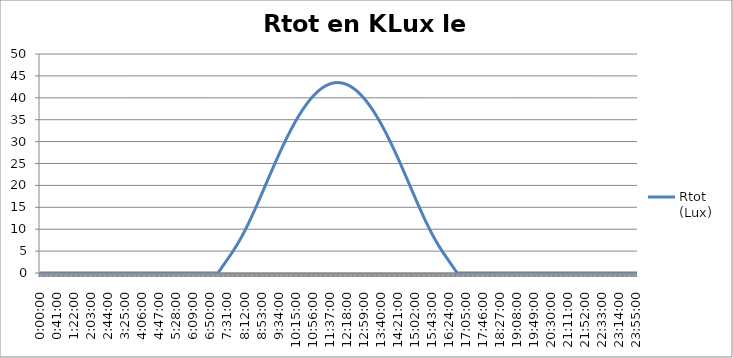
| Category | Rtot
(Lux) |
|---|---|
| 0.0 | 0 |
| 0.0006944444444444445 | 0 |
| 0.001388888888888889 | 0 |
| 0.0020833333333333333 | 0 |
| 0.002777777777777778 | 0 |
| 0.0034722222222222225 | 0 |
| 0.004166666666666667 | 0 |
| 0.004861111111111111 | 0 |
| 0.005555555555555556 | 0 |
| 0.00625 | 0 |
| 0.006944444444444445 | 0 |
| 0.0076388888888888895 | 0 |
| 0.008333333333333333 | 0 |
| 0.009027777777777777 | 0 |
| 0.00972222222222222 | 0 |
| 0.010416666666666664 | 0 |
| 0.011111111111111108 | 0 |
| 0.011805555555555552 | 0 |
| 0.012499999999999995 | 0 |
| 0.01319444444444444 | 0 |
| 0.013888888888888883 | 0 |
| 0.014583333333333327 | 0 |
| 0.01527777777777777 | 0 |
| 0.015972222222222214 | 0 |
| 0.01666666666666666 | 0 |
| 0.017361111111111105 | 0 |
| 0.01805555555555555 | 0 |
| 0.018749999999999996 | 0 |
| 0.01944444444444444 | 0 |
| 0.020138888888888887 | 0 |
| 0.020833333333333332 | 0 |
| 0.021527777777777778 | 0 |
| 0.022222222222222223 | 0 |
| 0.02291666666666667 | 0 |
| 0.023611111111111114 | 0 |
| 0.02430555555555556 | 0 |
| 0.025000000000000005 | 0 |
| 0.02569444444444445 | 0 |
| 0.026388888888888896 | 0 |
| 0.02708333333333334 | 0 |
| 0.027777777777777787 | 0 |
| 0.028472222222222232 | 0 |
| 0.029166666666666678 | 0 |
| 0.029861111111111123 | 0 |
| 0.03055555555555557 | 0 |
| 0.031250000000000014 | 0 |
| 0.031944444444444456 | 0 |
| 0.0326388888888889 | 0 |
| 0.03333333333333334 | 0 |
| 0.03402777777777778 | 0 |
| 0.034722222222222224 | 0 |
| 0.035416666666666666 | 0 |
| 0.03611111111111111 | 0 |
| 0.03680555555555555 | 0 |
| 0.03749999999999999 | 0 |
| 0.038194444444444434 | 0 |
| 0.038888888888888876 | 0 |
| 0.03958333333333332 | 0 |
| 0.04027777777777776 | 0 |
| 0.0409722222222222 | 0 |
| 0.041666666666666644 | 0 |
| 0.042361111111111086 | 0 |
| 0.04305555555555553 | 0 |
| 0.04374999999999997 | 0 |
| 0.04444444444444441 | 0 |
| 0.04513888888888885 | 0 |
| 0.045833333333333295 | 0 |
| 0.04652777777777774 | 0 |
| 0.04722222222222218 | 0 |
| 0.04791666666666662 | 0 |
| 0.04861111111111106 | 0 |
| 0.049305555555555505 | 0 |
| 0.04999999999999995 | 0 |
| 0.05069444444444439 | 0 |
| 0.05138888888888883 | 0 |
| 0.05208333333333327 | 0 |
| 0.052777777777777715 | 0 |
| 0.05347222222222216 | 0 |
| 0.0541666666666666 | 0 |
| 0.05486111111111104 | 0 |
| 0.05555555555555548 | 0 |
| 0.056249999999999925 | 0 |
| 0.05694444444444437 | 0 |
| 0.05763888888888881 | 0 |
| 0.05833333333333325 | 0 |
| 0.05902777777777769 | 0 |
| 0.059722222222222135 | 0 |
| 0.06041666666666658 | 0 |
| 0.06111111111111102 | 0 |
| 0.06180555555555546 | 0 |
| 0.0624999999999999 | 0 |
| 0.06319444444444434 | 0 |
| 0.06388888888888879 | 0 |
| 0.06458333333333323 | 0 |
| 0.06527777777777767 | 0 |
| 0.06597222222222211 | 0 |
| 0.06666666666666655 | 0 |
| 0.067361111111111 | 0 |
| 0.06805555555555544 | 0 |
| 0.06874999999999988 | 0 |
| 0.06944444444444432 | 0 |
| 0.07013888888888876 | 0 |
| 0.0708333333333332 | 0 |
| 0.07152777777777765 | 0 |
| 0.07222222222222209 | 0 |
| 0.07291666666666653 | 0 |
| 0.07361111111111097 | 0 |
| 0.07430555555555542 | 0 |
| 0.07499999999999986 | 0 |
| 0.0756944444444443 | 0 |
| 0.07638888888888874 | 0 |
| 0.07708333333333318 | 0 |
| 0.07777777777777763 | 0 |
| 0.07847222222222207 | 0 |
| 0.07916666666666651 | 0 |
| 0.07986111111111095 | 0 |
| 0.0805555555555554 | 0 |
| 0.08124999999999984 | 0 |
| 0.08194444444444428 | 0 |
| 0.08263888888888872 | 0 |
| 0.08333333333333316 | 0 |
| 0.0840277777777776 | 0 |
| 0.08472222222222205 | 0 |
| 0.08541666666666649 | 0 |
| 0.08611111111111093 | 0 |
| 0.08680555555555537 | 0 |
| 0.08749999999999981 | 0 |
| 0.08819444444444426 | 0 |
| 0.0888888888888887 | 0 |
| 0.08958333333333314 | 0 |
| 0.09027777777777758 | 0 |
| 0.09097222222222202 | 0 |
| 0.09166666666666647 | 0 |
| 0.09236111111111091 | 0 |
| 0.09305555555555535 | 0 |
| 0.09374999999999979 | 0 |
| 0.09444444444444423 | 0 |
| 0.09513888888888868 | 0 |
| 0.09583333333333312 | 0 |
| 0.09652777777777756 | 0 |
| 0.097222222222222 | 0 |
| 0.09791666666666644 | 0 |
| 0.09861111111111089 | 0 |
| 0.09930555555555533 | 0 |
| 0.09999999999999977 | 0 |
| 0.10069444444444421 | 0 |
| 0.10138888888888865 | 0 |
| 0.1020833333333331 | 0 |
| 0.10277777777777754 | 0 |
| 0.10347222222222198 | 0 |
| 0.10416666666666642 | 0 |
| 0.10486111111111086 | 0 |
| 0.1055555555555553 | 0 |
| 0.10624999999999975 | 0 |
| 0.10694444444444419 | 0 |
| 0.10763888888888863 | 0 |
| 0.10833333333333307 | 0 |
| 0.10902777777777752 | 0 |
| 0.10972222222222196 | 0 |
| 0.1104166666666664 | 0 |
| 0.11111111111111084 | 0 |
| 0.11180555555555528 | 0 |
| 0.11249999999999973 | 0 |
| 0.11319444444444417 | 0 |
| 0.11388888888888861 | 0 |
| 0.11458333333333305 | 0 |
| 0.1152777777777775 | 0 |
| 0.11597222222222194 | 0 |
| 0.11666666666666638 | 0 |
| 0.11736111111111082 | 0 |
| 0.11805555555555526 | 0 |
| 0.1187499999999997 | 0 |
| 0.11944444444444414 | 0 |
| 0.12013888888888859 | 0 |
| 0.12083333333333303 | 0 |
| 0.12152777777777747 | 0 |
| 0.12222222222222191 | 0 |
| 0.12291666666666635 | 0 |
| 0.1236111111111108 | 0 |
| 0.12430555555555524 | 0 |
| 0.12499999999999968 | 0 |
| 0.12569444444444414 | 0 |
| 0.12638888888888858 | 0 |
| 0.12708333333333302 | 0 |
| 0.12777777777777746 | 0 |
| 0.1284722222222219 | 0 |
| 0.12916666666666635 | 0 |
| 0.1298611111111108 | 0 |
| 0.13055555555555523 | 0 |
| 0.13124999999999967 | 0 |
| 0.13194444444444411 | 0 |
| 0.13263888888888856 | 0 |
| 0.133333333333333 | 0 |
| 0.13402777777777744 | 0 |
| 0.13472222222222188 | 0 |
| 0.13541666666666632 | 0 |
| 0.13611111111111077 | 0 |
| 0.1368055555555552 | 0 |
| 0.13749999999999965 | 0 |
| 0.1381944444444441 | 0 |
| 0.13888888888888853 | 0 |
| 0.13958333333333298 | 0 |
| 0.14027777777777742 | 0 |
| 0.14097222222222186 | 0 |
| 0.1416666666666663 | 0 |
| 0.14236111111111074 | 0 |
| 0.14305555555555519 | 0 |
| 0.14374999999999963 | 0 |
| 0.14444444444444407 | 0 |
| 0.1451388888888885 | 0 |
| 0.14583333333333295 | 0 |
| 0.1465277777777774 | 0 |
| 0.14722222222222184 | 0 |
| 0.14791666666666628 | 0 |
| 0.14861111111111072 | 0 |
| 0.14930555555555516 | 0 |
| 0.1499999999999996 | 0 |
| 0.15069444444444405 | 0 |
| 0.1513888888888885 | 0 |
| 0.15208333333333293 | 0 |
| 0.15277777777777737 | 0 |
| 0.15347222222222182 | 0 |
| 0.15416666666666626 | 0 |
| 0.1548611111111107 | 0 |
| 0.15555555555555514 | 0 |
| 0.15624999999999958 | 0 |
| 0.15694444444444403 | 0 |
| 0.15763888888888847 | 0 |
| 0.1583333333333329 | 0 |
| 0.15902777777777735 | 0 |
| 0.1597222222222218 | 0 |
| 0.16041666666666624 | 0 |
| 0.16111111111111068 | 0 |
| 0.16180555555555512 | 0 |
| 0.16249999999999956 | 0 |
| 0.163194444444444 | 0 |
| 0.16388888888888845 | 0 |
| 0.1645833333333329 | 0 |
| 0.16527777777777733 | 0 |
| 0.16597222222222177 | 0 |
| 0.1666666666666662 | 0 |
| 0.16736111111111066 | 0 |
| 0.1680555555555551 | 0 |
| 0.16874999999999954 | 0 |
| 0.16944444444444398 | 0 |
| 0.17013888888888842 | 0 |
| 0.17083333333333287 | 0 |
| 0.1715277777777773 | 0 |
| 0.17222222222222175 | 0 |
| 0.1729166666666662 | 0 |
| 0.17361111111111063 | 0 |
| 0.17430555555555508 | 0 |
| 0.17499999999999952 | 0 |
| 0.17569444444444396 | 0 |
| 0.1763888888888884 | 0 |
| 0.17708333333333284 | 0 |
| 0.17777777777777728 | 0 |
| 0.17847222222222173 | 0 |
| 0.17916666666666617 | 0 |
| 0.1798611111111106 | 0 |
| 0.18055555555555505 | 0 |
| 0.1812499999999995 | 0 |
| 0.18194444444444394 | 0 |
| 0.18263888888888838 | 0 |
| 0.18333333333333282 | 0 |
| 0.18402777777777726 | 0 |
| 0.1847222222222217 | 0 |
| 0.18541666666666615 | 0 |
| 0.1861111111111106 | 0 |
| 0.18680555555555503 | 0 |
| 0.18749999999999947 | 0 |
| 0.18819444444444391 | 0 |
| 0.18888888888888836 | 0 |
| 0.1895833333333328 | 0 |
| 0.19027777777777724 | 0 |
| 0.19097222222222168 | 0 |
| 0.19166666666666612 | 0 |
| 0.19236111111111057 | 0 |
| 0.193055555555555 | 0 |
| 0.19374999999999945 | 0 |
| 0.1944444444444439 | 0 |
| 0.19513888888888833 | 0 |
| 0.19583333333333278 | 0 |
| 0.19652777777777722 | 0 |
| 0.19722222222222166 | 0 |
| 0.1979166666666661 | 0 |
| 0.19861111111111054 | 0 |
| 0.199305555555555 | 0 |
| 0.19999999999999943 | 0 |
| 0.20069444444444387 | 0 |
| 0.2013888888888883 | 0 |
| 0.20208333333333275 | 0 |
| 0.2027777777777772 | 0 |
| 0.20347222222222164 | 0 |
| 0.20416666666666608 | 0 |
| 0.20486111111111052 | 0 |
| 0.20555555555555496 | 0 |
| 0.2062499999999994 | 0 |
| 0.20694444444444385 | 0 |
| 0.2076388888888883 | 0 |
| 0.20833333333333273 | 0 |
| 0.20902777777777717 | 0 |
| 0.20972222222222162 | 0 |
| 0.21041666666666606 | 0 |
| 0.2111111111111105 | 0 |
| 0.21180555555555494 | 0 |
| 0.21249999999999938 | 0 |
| 0.21319444444444383 | 0 |
| 0.21388888888888827 | 0 |
| 0.2145833333333327 | 0 |
| 0.21527777777777715 | 0 |
| 0.2159722222222216 | 0 |
| 0.21666666666666604 | 0 |
| 0.21736111111111048 | 0 |
| 0.21805555555555492 | 0 |
| 0.21874999999999936 | 0 |
| 0.2194444444444438 | 0 |
| 0.22013888888888825 | 0 |
| 0.2208333333333327 | 0 |
| 0.22152777777777713 | 0 |
| 0.22222222222222157 | 0 |
| 0.222916666666666 | 0 |
| 0.22361111111111046 | 0 |
| 0.2243055555555549 | 0 |
| 0.22499999999999934 | 0 |
| 0.22569444444444378 | 0 |
| 0.22638888888888822 | 0 |
| 0.22708333333333267 | 0 |
| 0.2277777777777771 | 0 |
| 0.22847222222222155 | 0 |
| 0.229166666666666 | 0 |
| 0.22986111111111043 | 0 |
| 0.23055555555555488 | 0 |
| 0.23124999999999932 | 0 |
| 0.23194444444444376 | 0 |
| 0.2326388888888882 | 0 |
| 0.23333333333333264 | 0 |
| 0.23402777777777709 | 0 |
| 0.23472222222222153 | 0 |
| 0.23541666666666597 | 0 |
| 0.2361111111111104 | 0 |
| 0.23680555555555485 | 0 |
| 0.2374999999999993 | 0 |
| 0.23819444444444374 | 0 |
| 0.23888888888888818 | 0 |
| 0.23958333333333262 | 0 |
| 0.24027777777777706 | 0 |
| 0.2409722222222215 | 0 |
| 0.24166666666666595 | 0 |
| 0.2423611111111104 | 0 |
| 0.24305555555555483 | 0 |
| 0.24374999999999927 | 0 |
| 0.24444444444444371 | 0 |
| 0.24513888888888816 | 0 |
| 0.2458333333333326 | 0 |
| 0.24652777777777704 | 0 |
| 0.24722222222222148 | 0 |
| 0.24791666666666592 | 0 |
| 0.24861111111111037 | 0 |
| 0.2493055555555548 | 0 |
| 0.24999999999999925 | 0 |
| 0.2506944444444437 | 0 |
| 0.25138888888888816 | 0 |
| 0.2520833333333326 | 0 |
| 0.25277777777777705 | 0 |
| 0.2534722222222215 | 0 |
| 0.25416666666666593 | 0 |
| 0.25486111111111037 | 0 |
| 0.2555555555555548 | 0 |
| 0.25624999999999926 | 0 |
| 0.2569444444444437 | 0 |
| 0.25763888888888814 | 0 |
| 0.2583333333333326 | 0 |
| 0.259027777777777 | 0 |
| 0.25972222222222147 | 0 |
| 0.2604166666666659 | 0 |
| 0.26111111111111035 | 0 |
| 0.2618055555555548 | 0 |
| 0.26249999999999923 | 0 |
| 0.2631944444444437 | 0 |
| 0.2638888888888881 | 0 |
| 0.26458333333333256 | 0 |
| 0.265277777777777 | 0 |
| 0.26597222222222144 | 0 |
| 0.2666666666666659 | 0 |
| 0.26736111111111033 | 0 |
| 0.26805555555555477 | 0 |
| 0.2687499999999992 | 0 |
| 0.26944444444444365 | 0 |
| 0.2701388888888881 | 0 |
| 0.27083333333333254 | 0 |
| 0.271527777777777 | 0 |
| 0.2722222222222214 | 0 |
| 0.27291666666666586 | 0 |
| 0.2736111111111103 | 0 |
| 0.27430555555555475 | 0 |
| 0.2749999999999992 | 0 |
| 0.27569444444444363 | 0 |
| 0.2763888888888881 | 0 |
| 0.2770833333333325 | 0 |
| 0.27777777777777696 | 0 |
| 0.2784722222222214 | 0 |
| 0.27916666666666584 | 0 |
| 0.2798611111111103 | 0 |
| 0.2805555555555547 | 0 |
| 0.28124999999999917 | 0 |
| 0.2819444444444436 | 0 |
| 0.28263888888888805 | 0 |
| 0.2833333333333325 | 0 |
| 0.28402777777777694 | 0 |
| 0.2847222222222214 | 0 |
| 0.2854166666666658 | 0 |
| 0.28611111111111026 | 0 |
| 0.2868055555555547 | 0 |
| 0.28749999999999915 | 0 |
| 0.2881944444444436 | 0 |
| 0.28888888888888803 | 0 |
| 0.28958333333333247 | 0 |
| 0.2902777777777769 | 0 |
| 0.29097222222222136 | 0 |
| 0.2916666666666658 | 0 |
| 0.29236111111111024 | 0 |
| 0.2930555555555547 | 0 |
| 0.2937499999999991 | 0 |
| 0.29444444444444356 | 0 |
| 0.295138888888888 | 0 |
| 0.29583333333333245 | 0 |
| 0.2965277777777769 | 0 |
| 0.29722222222222133 | 0 |
| 0.2979166666666658 | 108.372 |
| 0.2986111111111102 | 247.893 |
| 0.29930555555555466 | 387.211 |
| 0.2999999999999991 | 526.324 |
| 0.30069444444444354 | 665.228 |
| 0.301388888888888 | 803.922 |
| 0.3020833333333324 | 942.404 |
| 0.30277777777777687 | 1080.672 |
| 0.3034722222222213 | 1218.726 |
| 0.30416666666666575 | 1356.567 |
| 0.3048611111111102 | 1494.197 |
| 0.30555555555555464 | 1631.621 |
| 0.3062499999999991 | 1768.845 |
| 0.3069444444444435 | 1905.88 |
| 0.30763888888888796 | 2042.74 |
| 0.3083333333333324 | 2179.444 |
| 0.30902777777777685 | 2316.014 |
| 0.3097222222222213 | 2452.478 |
| 0.31041666666666573 | 2588.871 |
| 0.3111111111111102 | 2725.229 |
| 0.3118055555555546 | 2861.598 |
| 0.31249999999999906 | 2998.024 |
| 0.3131944444444435 | 3134.56 |
| 0.31388888888888794 | 3271.265 |
| 0.3145833333333324 | 3408.198 |
| 0.3152777777777768 | 3545.423 |
| 0.31597222222222127 | 3683.007 |
| 0.3166666666666657 | 3821.016 |
| 0.31736111111111015 | 3959.52 |
| 0.3180555555555546 | 4098.59 |
| 0.31874999999999903 | 4238.293 |
| 0.3194444444444435 | 4378.7 |
| 0.3201388888888879 | 4519.878 |
| 0.32083333333333236 | 4661.894 |
| 0.3215277777777768 | 4804.812 |
| 0.32222222222222124 | 4948.695 |
| 0.3229166666666657 | 5093.602 |
| 0.32361111111111013 | 5239.59 |
| 0.32430555555555457 | 5386.712 |
| 0.324999999999999 | 5535.019 |
| 0.32569444444444345 | 5684.557 |
| 0.3263888888888879 | 5835.371 |
| 0.32708333333333234 | 5987.5 |
| 0.3277777777777768 | 6140.982 |
| 0.3284722222222212 | 6295.848 |
| 0.32916666666666566 | 6452.128 |
| 0.3298611111111101 | 6609.849 |
| 0.33055555555555455 | 6769.032 |
| 0.331249999999999 | 6929.698 |
| 0.33194444444444343 | 7091.862 |
| 0.3326388888888879 | 7255.538 |
| 0.3333333333333323 | 7420.734 |
| 0.33402777777777676 | 7587.459 |
| 0.3347222222222212 | 7755.717 |
| 0.33541666666666564 | 7925.509 |
| 0.3361111111111101 | 8096.835 |
| 0.3368055555555545 | 8269.691 |
| 0.33749999999999897 | 8444.071 |
| 0.3381944444444434 | 8619.969 |
| 0.33888888888888785 | 8797.374 |
| 0.3395833333333323 | 8976.276 |
| 0.34027777777777674 | 9156.659 |
| 0.3409722222222212 | 9338.51 |
| 0.3416666666666656 | 9521.813 |
| 0.34236111111111006 | 9706.547 |
| 0.3430555555555545 | 9892.696 |
| 0.34374999999999895 | 10080.237 |
| 0.3444444444444434 | 10269.148 |
| 0.34513888888888783 | 10459.408 |
| 0.34583333333333227 | 10650.992 |
| 0.3465277777777767 | 10843.874 |
| 0.34722222222222116 | 11038.03 |
| 0.3479166666666656 | 11233.434 |
| 0.34861111111111004 | 11430.057 |
| 0.3493055555555545 | 11627.872 |
| 0.3499999999999989 | 11826.851 |
| 0.35069444444444337 | 12026.965 |
| 0.3513888888888878 | 12228.185 |
| 0.35208333333333225 | 12430.48 |
| 0.3527777777777767 | 12633.822 |
| 0.35347222222222113 | 12838.18 |
| 0.3541666666666656 | 13043.523 |
| 0.35486111111111 | 13249.82 |
| 0.35555555555555446 | 13457.041 |
| 0.3562499999999989 | 13665.154 |
| 0.35694444444444334 | 13874.129 |
| 0.3576388888888878 | 14083.933 |
| 0.3583333333333322 | 14294.536 |
| 0.35902777777777667 | 14505.907 |
| 0.3597222222222211 | 14718.013 |
| 0.36041666666666555 | 14930.824 |
| 0.36111111111111 | 15144.308 |
| 0.36180555555555444 | 15358.435 |
| 0.3624999999999989 | 15573.173 |
| 0.3631944444444433 | 15788.492 |
| 0.36388888888888776 | 16004.359 |
| 0.3645833333333322 | 16220.746 |
| 0.36527777777777665 | 16437.62 |
| 0.3659722222222211 | 16654.953 |
| 0.36666666666666553 | 16872.713 |
| 0.36736111111111 | 17090.87 |
| 0.3680555555555544 | 17309.396 |
| 0.36874999999999886 | 17528.26 |
| 0.3694444444444433 | 17747.432 |
| 0.37013888888888774 | 17966.884 |
| 0.3708333333333322 | 18186.587 |
| 0.3715277777777766 | 18406.512 |
| 0.37222222222222107 | 18626.631 |
| 0.3729166666666655 | 18846.915 |
| 0.37361111111110995 | 19067.336 |
| 0.3743055555555544 | 19287.868 |
| 0.37499999999999883 | 19508.481 |
| 0.3756944444444433 | 19729.15 |
| 0.3763888888888877 | 19949.847 |
| 0.37708333333333216 | 20170.545 |
| 0.3777777777777766 | 20391.219 |
| 0.37847222222222104 | 20611.841 |
| 0.3791666666666655 | 20832.387 |
| 0.37986111111110993 | 21052.83 |
| 0.38055555555555437 | 21273.146 |
| 0.3812499999999988 | 21493.309 |
| 0.38194444444444325 | 21713.294 |
| 0.3826388888888877 | 21933.077 |
| 0.38333333333333214 | 22152.634 |
| 0.3840277777777766 | 22371.941 |
| 0.384722222222221 | 22590.973 |
| 0.38541666666666546 | 22809.708 |
| 0.3861111111111099 | 23028.122 |
| 0.38680555555555435 | 23246.193 |
| 0.3874999999999988 | 23463.897 |
| 0.38819444444444323 | 23681.212 |
| 0.3888888888888877 | 23898.117 |
| 0.3895833333333321 | 24114.589 |
| 0.39027777777777656 | 24330.607 |
| 0.390972222222221 | 24546.149 |
| 0.39166666666666544 | 24761.194 |
| 0.3923611111111099 | 24975.721 |
| 0.3930555555555543 | 25189.71 |
| 0.39374999999999877 | 25403.14 |
| 0.3944444444444432 | 25615.991 |
| 0.39513888888888765 | 25828.243 |
| 0.3958333333333321 | 26039.876 |
| 0.39652777777777654 | 26250.872 |
| 0.397222222222221 | 26461.211 |
| 0.3979166666666654 | 26670.873 |
| 0.39861111111110986 | 26879.84 |
| 0.3993055555555543 | 27088.095 |
| 0.39999999999999875 | 27295.617 |
| 0.4006944444444432 | 27502.39 |
| 0.40138888888888763 | 27708.395 |
| 0.40208333333333207 | 27913.615 |
| 0.4027777777777765 | 28118.032 |
| 0.40347222222222096 | 28321.629 |
| 0.4041666666666654 | 28524.39 |
| 0.40486111111110984 | 28726.297 |
| 0.4055555555555543 | 28927.334 |
| 0.4062499999999987 | 29127.485 |
| 0.40694444444444317 | 29326.733 |
| 0.4076388888888876 | 29525.062 |
| 0.40833333333333205 | 29722.457 |
| 0.4090277777777765 | 29918.902 |
| 0.40972222222222093 | 30114.382 |
| 0.4104166666666654 | 30308.882 |
| 0.4111111111111098 | 30502.386 |
| 0.41180555555555426 | 30694.88 |
| 0.4124999999999987 | 30886.349 |
| 0.41319444444444314 | 31076.779 |
| 0.4138888888888876 | 31266.155 |
| 0.414583333333332 | 31454.464 |
| 0.41527777777777647 | 31641.692 |
| 0.4159722222222209 | 31827.824 |
| 0.41666666666666535 | 32012.848 |
| 0.4173611111111098 | 32196.75 |
| 0.41805555555555424 | 32379.517 |
| 0.4187499999999987 | 32561.136 |
| 0.4194444444444431 | 32741.593 |
| 0.42013888888888756 | 32920.877 |
| 0.420833333333332 | 33098.975 |
| 0.42152777777777645 | 33275.875 |
| 0.4222222222222209 | 33451.563 |
| 0.42291666666666533 | 33626.029 |
| 0.4236111111111098 | 33799.261 |
| 0.4243055555555542 | 33971.246 |
| 0.42499999999999866 | 34141.973 |
| 0.4256944444444431 | 34311.432 |
| 0.42638888888888754 | 34479.609 |
| 0.427083333333332 | 34646.495 |
| 0.4277777777777764 | 34812.079 |
| 0.42847222222222087 | 34976.349 |
| 0.4291666666666653 | 35139.295 |
| 0.42986111111110975 | 35300.907 |
| 0.4305555555555542 | 35461.173 |
| 0.43124999999999863 | 35620.085 |
| 0.4319444444444431 | 35777.632 |
| 0.4326388888888875 | 35933.803 |
| 0.43333333333333196 | 36088.589 |
| 0.4340277777777764 | 36241.981 |
| 0.43472222222222084 | 36393.969 |
| 0.4354166666666653 | 36544.543 |
| 0.43611111111110973 | 36693.695 |
| 0.43680555555555417 | 36841.414 |
| 0.4374999999999986 | 36987.693 |
| 0.43819444444444305 | 37132.521 |
| 0.4388888888888875 | 37275.892 |
| 0.43958333333333194 | 37417.795 |
| 0.4402777777777764 | 37558.222 |
| 0.4409722222222208 | 37697.166 |
| 0.44166666666666526 | 37834.617 |
| 0.4423611111111097 | 37970.568 |
| 0.44305555555555415 | 38105.01 |
| 0.4437499999999986 | 38237.937 |
| 0.44444444444444303 | 38369.339 |
| 0.4451388888888875 | 38499.21 |
| 0.4458333333333319 | 38627.542 |
| 0.44652777777777636 | 38754.327 |
| 0.4472222222222208 | 38879.559 |
| 0.44791666666666524 | 39003.229 |
| 0.4486111111111097 | 39125.332 |
| 0.4493055555555541 | 39245.86 |
| 0.44999999999999857 | 39364.807 |
| 0.450694444444443 | 39482.165 |
| 0.45138888888888745 | 39597.928 |
| 0.4520833333333319 | 39712.09 |
| 0.45277777777777634 | 39824.644 |
| 0.4534722222222208 | 39935.584 |
| 0.4541666666666652 | 40044.904 |
| 0.45486111111110966 | 40152.597 |
| 0.4555555555555541 | 40258.659 |
| 0.45624999999999855 | 40363.083 |
| 0.456944444444443 | 40465.863 |
| 0.45763888888888743 | 40566.994 |
| 0.45833333333333187 | 40666.471 |
| 0.4590277777777763 | 40764.287 |
| 0.45972222222222076 | 40860.438 |
| 0.4604166666666652 | 40954.919 |
| 0.46111111111110964 | 41047.724 |
| 0.4618055555555541 | 41138.849 |
| 0.4624999999999985 | 41228.288 |
| 0.46319444444444297 | 41316.037 |
| 0.4638888888888874 | 41402.091 |
| 0.46458333333333185 | 41486.446 |
| 0.4652777777777763 | 41569.097 |
| 0.46597222222222073 | 41650.039 |
| 0.4666666666666652 | 41729.269 |
| 0.4673611111111096 | 41806.783 |
| 0.46805555555555406 | 41882.576 |
| 0.4687499999999985 | 41956.644 |
| 0.46944444444444294 | 42028.984 |
| 0.4701388888888874 | 42099.592 |
| 0.4708333333333318 | 42168.464 |
| 0.47152777777777627 | 42235.596 |
| 0.4722222222222207 | 42300.985 |
| 0.47291666666666515 | 42364.628 |
| 0.4736111111111096 | 42426.521 |
| 0.47430555555555404 | 42486.661 |
| 0.4749999999999985 | 42545.046 |
| 0.4756944444444429 | 42601.672 |
| 0.47638888888888736 | 42656.535 |
| 0.4770833333333318 | 42709.635 |
| 0.47777777777777625 | 42760.966 |
| 0.4784722222222207 | 42810.528 |
| 0.47916666666666513 | 42858.318 |
| 0.4798611111111096 | 42904.332 |
| 0.480555555555554 | 42948.57 |
| 0.48124999999999846 | 42991.028 |
| 0.4819444444444429 | 43031.704 |
| 0.48263888888888734 | 43070.597 |
| 0.4833333333333318 | 43107.704 |
| 0.4840277777777762 | 43143.023 |
| 0.48472222222222067 | 43176.553 |
| 0.4854166666666651 | 43208.292 |
| 0.48611111111110955 | 43238.239 |
| 0.486805555555554 | 43266.392 |
| 0.48749999999999843 | 43292.748 |
| 0.4881944444444429 | 43317.309 |
| 0.4888888888888873 | 43340.071 |
| 0.48958333333333176 | 43361.034 |
| 0.4902777777777762 | 43380.196 |
| 0.49097222222222064 | 43397.558 |
| 0.4916666666666651 | 43413.117 |
| 0.49236111111110953 | 43426.873 |
| 0.49305555555555397 | 43438.826 |
| 0.4937499999999984 | 43448.975 |
| 0.49444444444444285 | 43457.319 |
| 0.4951388888888873 | 43463.858 |
| 0.49583333333333174 | 43468.592 |
| 0.4965277777777762 | 43471.519 |
| 0.4972222222222206 | 43472.642 |
| 0.49791666666666506 | 43471.958 |
| 0.4986111111111095 | 43469.468 |
| 0.49930555555555395 | 43465.173 |
| 0.4999999999999984 | 43459.072 |
| 0.5006944444444429 | 43451.167 |
| 0.5013888888888873 | 43441.456 |
| 0.5020833333333318 | 43429.941 |
| 0.5027777777777762 | 43416.622 |
| 0.5034722222222207 | 43401.501 |
| 0.5041666666666651 | 43384.577 |
| 0.5048611111111095 | 43365.851 |
| 0.505555555555554 | 43345.325 |
| 0.5062499999999984 | 43323 |
| 0.5069444444444429 | 43298.876 |
| 0.5076388888888873 | 43272.955 |
| 0.5083333333333317 | 43245.239 |
| 0.5090277777777762 | 43215.728 |
| 0.5097222222222206 | 43184.423 |
| 0.5104166666666651 | 43151.328 |
| 0.5111111111111095 | 43116.443 |
| 0.511805555555554 | 43079.77 |
| 0.5124999999999984 | 43041.31 |
| 0.5131944444444428 | 43001.067 |
| 0.5138888888888873 | 42959.041 |
| 0.5145833333333317 | 42915.236 |
| 0.5152777777777762 | 42869.652 |
| 0.5159722222222206 | 42822.294 |
| 0.516666666666665 | 42773.162 |
| 0.5173611111111095 | 42722.259 |
| 0.5180555555555539 | 42669.589 |
| 0.5187499999999984 | 42615.153 |
| 0.5194444444444428 | 42558.955 |
| 0.5201388888888873 | 42500.997 |
| 0.5208333333333317 | 42441.283 |
| 0.5215277777777761 | 42379.815 |
| 0.5222222222222206 | 42316.597 |
| 0.522916666666665 | 42251.631 |
| 0.5236111111111095 | 42184.922 |
| 0.5243055555555539 | 42116.472 |
| 0.5249999999999984 | 42046.286 |
| 0.5256944444444428 | 41974.366 |
| 0.5263888888888872 | 41900.717 |
| 0.5270833333333317 | 41825.342 |
| 0.5277777777777761 | 41748.246 |
| 0.5284722222222206 | 41669.432 |
| 0.529166666666665 | 41588.905 |
| 0.5298611111111095 | 41506.668 |
| 0.5305555555555539 | 41422.727 |
| 0.5312499999999983 | 41337.085 |
| 0.5319444444444428 | 41249.747 |
| 0.5326388888888872 | 41160.717 |
| 0.5333333333333317 | 41070.002 |
| 0.5340277777777761 | 40977.604 |
| 0.5347222222222205 | 40883.53 |
| 0.535416666666665 | 40787.784 |
| 0.5361111111111094 | 40690.371 |
| 0.5368055555555539 | 40591.297 |
| 0.5374999999999983 | 40490.567 |
| 0.5381944444444428 | 40388.187 |
| 0.5388888888888872 | 40284.162 |
| 0.5395833333333316 | 40178.497 |
| 0.5402777777777761 | 40071.199 |
| 0.5409722222222205 | 39962.273 |
| 0.541666666666665 | 39851.726 |
| 0.5423611111111094 | 39739.563 |
| 0.5430555555555538 | 39625.791 |
| 0.5437499999999983 | 39510.416 |
| 0.5444444444444427 | 39393.445 |
| 0.5451388888888872 | 39274.883 |
| 0.5458333333333316 | 39154.739 |
| 0.5465277777777761 | 39033.017 |
| 0.5472222222222205 | 38909.727 |
| 0.5479166666666649 | 38784.873 |
| 0.5486111111111094 | 38658.465 |
| 0.5493055555555538 | 38530.508 |
| 0.5499999999999983 | 38401.01 |
| 0.5506944444444427 | 38269.978 |
| 0.5513888888888872 | 38137.421 |
| 0.5520833333333316 | 38003.346 |
| 0.552777777777776 | 37867.761 |
| 0.5534722222222205 | 37730.673 |
| 0.5541666666666649 | 37592.091 |
| 0.5548611111111094 | 37452.023 |
| 0.5555555555555538 | 37310.477 |
| 0.5562499999999982 | 37167.463 |
| 0.5569444444444427 | 37022.987 |
| 0.5576388888888871 | 36877.06 |
| 0.5583333333333316 | 36729.689 |
| 0.559027777777776 | 36580.885 |
| 0.5597222222222205 | 36430.655 |
| 0.5604166666666649 | 36279.01 |
| 0.5611111111111093 | 36125.958 |
| 0.5618055555555538 | 35971.509 |
| 0.5624999999999982 | 35815.673 |
| 0.5631944444444427 | 35658.459 |
| 0.5638888888888871 | 35499.878 |
| 0.5645833333333315 | 35339.94 |
| 0.565277777777776 | 35178.653 |
| 0.5659722222222204 | 35016.03 |
| 0.5666666666666649 | 34852.081 |
| 0.5673611111111093 | 34686.815 |
| 0.5680555555555538 | 34520.244 |
| 0.5687499999999982 | 34352.379 |
| 0.5694444444444426 | 34183.231 |
| 0.5701388888888871 | 34012.811 |
| 0.5708333333333315 | 33841.13 |
| 0.571527777777776 | 33668.2 |
| 0.5722222222222204 | 33494.032 |
| 0.5729166666666649 | 33318.639 |
| 0.5736111111111093 | 33142.033 |
| 0.5743055555555537 | 32964.225 |
| 0.5749999999999982 | 32785.227 |
| 0.5756944444444426 | 32605.054 |
| 0.5763888888888871 | 32423.716 |
| 0.5770833333333315 | 32241.226 |
| 0.577777777777776 | 32057.599 |
| 0.5784722222222204 | 31872.846 |
| 0.5791666666666648 | 31686.981 |
| 0.5798611111111093 | 31500.018 |
| 0.5805555555555537 | 31311.971 |
| 0.5812499999999982 | 31122.852 |
| 0.5819444444444426 | 30932.677 |
| 0.582638888888887 | 30741.459 |
| 0.5833333333333315 | 30549.212 |
| 0.5840277777777759 | 30355.952 |
| 0.5847222222222204 | 30161.693 |
| 0.5854166666666648 | 29966.449 |
| 0.5861111111111093 | 29770.237 |
| 0.5868055555555537 | 29573.071 |
| 0.5874999999999981 | 29374.967 |
| 0.5881944444444426 | 29175.941 |
| 0.588888888888887 | 28976.008 |
| 0.5895833333333315 | 28775.185 |
| 0.5902777777777759 | 28573.487 |
| 0.5909722222222203 | 28370.932 |
| 0.5916666666666648 | 28167.536 |
| 0.5923611111111092 | 27963.317 |
| 0.5930555555555537 | 27758.29 |
| 0.5937499999999981 | 27552.474 |
| 0.5944444444444426 | 27345.886 |
| 0.595138888888887 | 27138.544 |
| 0.5958333333333314 | 26930.466 |
| 0.5965277777777759 | 26721.67 |
| 0.5972222222222203 | 26512.174 |
| 0.5979166666666648 | 26301.998 |
| 0.5986111111111092 | 26091.161 |
| 0.5993055555555536 | 25879.68 |
| 0.5999999999999981 | 25667.576 |
| 0.6006944444444425 | 25454.869 |
| 0.601388888888887 | 25241.577 |
| 0.6020833333333314 | 25027.722 |
| 0.6027777777777759 | 24813.324 |
| 0.6034722222222203 | 24598.403 |
| 0.6041666666666647 | 24382.98 |
| 0.6048611111111092 | 24167.076 |
| 0.6055555555555536 | 23950.712 |
| 0.6062499999999981 | 23733.91 |
| 0.6069444444444425 | 23516.692 |
| 0.607638888888887 | 23299.08 |
| 0.6083333333333314 | 23081.097 |
| 0.6090277777777758 | 22862.764 |
| 0.6097222222222203 | 22644.105 |
| 0.6104166666666647 | 22425.142 |
| 0.6111111111111092 | 22205.9 |
| 0.6118055555555536 | 21986.402 |
| 0.612499999999998 | 21766.672 |
| 0.6131944444444425 | 21546.733 |
| 0.6138888888888869 | 21326.611 |
| 0.6145833333333314 | 21106.33 |
| 0.6152777777777758 | 20885.916 |
| 0.6159722222222203 | 20665.393 |
| 0.6166666666666647 | 20444.786 |
| 0.6173611111111091 | 20224.123 |
| 0.6180555555555536 | 20003.428 |
| 0.618749999999998 | 19782.728 |
| 0.6194444444444425 | 19562.05 |
| 0.6201388888888869 | 19341.421 |
| 0.6208333333333313 | 19120.867 |
| 0.6215277777777758 | 18900.416 |
| 0.6222222222222202 | 18680.096 |
| 0.6229166666666647 | 18459.935 |
| 0.6236111111111091 | 18239.96 |
| 0.6243055555555536 | 18020.201 |
| 0.624999999999998 | 17800.685 |
| 0.6256944444444424 | 17581.442 |
| 0.6263888888888869 | 17362.501 |
| 0.6270833333333313 | 17143.89 |
| 0.6277777777777758 | 16925.641 |
| 0.6284722222222202 | 16707.781 |
| 0.6291666666666647 | 16490.342 |
| 0.6298611111111091 | 16273.354 |
| 0.6305555555555535 | 16056.846 |
| 0.631249999999998 | 15840.85 |
| 0.6319444444444424 | 15625.395 |
| 0.6326388888888869 | 15410.513 |
| 0.6333333333333313 | 15196.235 |
| 0.6340277777777757 | 14982.592 |
| 0.6347222222222202 | 14769.615 |
| 0.6354166666666646 | 14557.334 |
| 0.6361111111111091 | 14345.782 |
| 0.6368055555555535 | 14134.99 |
| 0.637499999999998 | 13924.989 |
| 0.6381944444444424 | 13715.81 |
| 0.6388888888888868 | 13507.485 |
| 0.6395833333333313 | 13300.045 |
| 0.6402777777777757 | 13093.52 |
| 0.6409722222222202 | 12887.943 |
| 0.6416666666666646 | 12683.343 |
| 0.642361111111109 | 12479.752 |
| 0.6430555555555535 | 12277.199 |
| 0.6437499999999979 | 12075.716 |
| 0.6444444444444424 | 11875.331 |
| 0.6451388888888868 | 11676.073 |
| 0.6458333333333313 | 11477.973 |
| 0.6465277777777757 | 11281.058 |
| 0.6472222222222201 | 11085.356 |
| 0.6479166666666646 | 10890.895 |
| 0.648611111111109 | 10697.7 |
| 0.6493055555555535 | 10505.799 |
| 0.6499999999999979 | 10315.216 |
| 0.6506944444444424 | 10125.975 |
| 0.6513888888888868 | 9938.099 |
| 0.6520833333333312 | 9751.611 |
| 0.6527777777777757 | 9566.531 |
| 0.6534722222222201 | 9382.879 |
| 0.6541666666666646 | 9200.674 |
| 0.654861111111109 | 9019.933 |
| 0.6555555555555534 | 8840.67 |
| 0.6562499999999979 | 8662.901 |
| 0.6569444444444423 | 8486.636 |
| 0.6576388888888868 | 8311.886 |
| 0.6583333333333312 | 8138.659 |
| 0.6590277777777757 | 7966.962 |
| 0.6597222222222201 | 7796.797 |
| 0.6604166666666645 | 7628.167 |
| 0.661111111111109 | 7461.07 |
| 0.6618055555555534 | 7295.503 |
| 0.6624999999999979 | 7131.459 |
| 0.6631944444444423 | 6968.929 |
| 0.6638888888888868 | 6807.901 |
| 0.6645833333333312 | 6648.359 |
| 0.6652777777777756 | 6490.286 |
| 0.6659722222222201 | 6333.658 |
| 0.6666666666666645 | 6178.451 |
| 0.667361111111109 | 6024.636 |
| 0.6680555555555534 | 5872.182 |
| 0.6687499999999978 | 5721.052 |
| 0.6694444444444423 | 5571.208 |
| 0.6701388888888867 | 5422.606 |
| 0.6708333333333312 | 5275.201 |
| 0.6715277777777756 | 5128.943 |
| 0.6722222222222201 | 4983.779 |
| 0.6729166666666645 | 4839.653 |
| 0.6736111111111089 | 4696.506 |
| 0.6743055555555534 | 4554.277 |
| 0.6749999999999978 | 4412.901 |
| 0.6756944444444423 | 4272.313 |
| 0.6763888888888867 | 4132.445 |
| 0.6770833333333311 | 3993.228 |
| 0.6777777777777756 | 3854.593 |
| 0.67847222222222 | 3716.47 |
| 0.6791666666666645 | 3578.79 |
| 0.6798611111111089 | 3441.484 |
| 0.6805555555555534 | 3304.486 |
| 0.6812499999999978 | 3167.731 |
| 0.6819444444444422 | 3031.159 |
| 0.6826388888888867 | 2894.711 |
| 0.6833333333333311 | 2758.334 |
| 0.6840277777777756 | 2621.977 |
| 0.68472222222222 | 2485.597 |
| 0.6854166666666645 | 2349.153 |
| 0.6861111111111089 | 2212.611 |
| 0.6868055555555533 | 2075.942 |
| 0.6874999999999978 | 1939.122 |
| 0.6881944444444422 | 1802.131 |
| 0.6888888888888867 | 1664.953 |
| 0.6895833333333311 | 1527.579 |
| 0.6902777777777755 | 1390 |
| 0.69097222222222 | 1252.21 |
| 0.6916666666666644 | 1114.208 |
| 0.6923611111111089 | 975.992 |
| 0.6930555555555533 | 837.562 |
| 0.6937499999999978 | 698.919 |
| 0.6944444444444422 | 560.066 |
| 0.6951388888888866 | 421.004 |
| 0.6958333333333311 | 281.735 |
| 0.6965277777777755 | 142.263 |
| 0.69722222222222 | 2.59 |
| 0.6979166666666644 | 0 |
| 0.6986111111111089 | 0 |
| 0.6993055555555533 | 0 |
| 0.6999999999999977 | 0 |
| 0.7006944444444422 | 0 |
| 0.7013888888888866 | 0 |
| 0.7020833333333311 | 0 |
| 0.7027777777777755 | 0 |
| 0.70347222222222 | 0 |
| 0.7041666666666644 | 0 |
| 0.7048611111111088 | 0 |
| 0.7055555555555533 | 0 |
| 0.7062499999999977 | 0 |
| 0.7069444444444422 | 0 |
| 0.7076388888888866 | 0 |
| 0.708333333333331 | 0 |
| 0.7090277777777755 | 0 |
| 0.7097222222222199 | 0 |
| 0.7104166666666644 | 0 |
| 0.7111111111111088 | 0 |
| 0.7118055555555532 | 0 |
| 0.7124999999999977 | 0 |
| 0.7131944444444421 | 0 |
| 0.7138888888888866 | 0 |
| 0.714583333333331 | 0 |
| 0.7152777777777755 | 0 |
| 0.7159722222222199 | 0 |
| 0.7166666666666643 | 0 |
| 0.7173611111111088 | 0 |
| 0.7180555555555532 | 0 |
| 0.7187499999999977 | 0 |
| 0.7194444444444421 | 0 |
| 0.7201388888888866 | 0 |
| 0.720833333333331 | 0 |
| 0.7215277777777754 | 0 |
| 0.7222222222222199 | 0 |
| 0.7229166666666643 | 0 |
| 0.7236111111111088 | 0 |
| 0.7243055555555532 | 0 |
| 0.7249999999999976 | 0 |
| 0.7256944444444421 | 0 |
| 0.7263888888888865 | 0 |
| 0.727083333333331 | 0 |
| 0.7277777777777754 | 0 |
| 0.7284722222222199 | 0 |
| 0.7291666666666643 | 0 |
| 0.7298611111111087 | 0 |
| 0.7305555555555532 | 0 |
| 0.7312499999999976 | 0 |
| 0.7319444444444421 | 0 |
| 0.7326388888888865 | 0 |
| 0.733333333333331 | 0 |
| 0.7340277777777754 | 0 |
| 0.7347222222222198 | 0 |
| 0.7354166666666643 | 0 |
| 0.7361111111111087 | 0 |
| 0.7368055555555532 | 0 |
| 0.7374999999999976 | 0 |
| 0.738194444444442 | 0 |
| 0.7388888888888865 | 0 |
| 0.7395833333333309 | 0 |
| 0.7402777777777754 | 0 |
| 0.7409722222222198 | 0 |
| 0.7416666666666643 | 0 |
| 0.7423611111111087 | 0 |
| 0.7430555555555531 | 0 |
| 0.7437499999999976 | 0 |
| 0.744444444444442 | 0 |
| 0.7451388888888865 | 0 |
| 0.7458333333333309 | 0 |
| 0.7465277777777753 | 0 |
| 0.7472222222222198 | 0 |
| 0.7479166666666642 | 0 |
| 0.7486111111111087 | 0 |
| 0.7493055555555531 | 0 |
| 0.7499999999999976 | 0 |
| 0.750694444444442 | 0 |
| 0.7513888888888864 | 0 |
| 0.7520833333333309 | 0 |
| 0.7527777777777753 | 0 |
| 0.7534722222222198 | 0 |
| 0.7541666666666642 | 0 |
| 0.7548611111111087 | 0 |
| 0.7555555555555531 | 0 |
| 0.7562499999999975 | 0 |
| 0.756944444444442 | 0 |
| 0.7576388888888864 | 0 |
| 0.7583333333333309 | 0 |
| 0.7590277777777753 | 0 |
| 0.7597222222222197 | 0 |
| 0.7604166666666642 | 0 |
| 0.7611111111111086 | 0 |
| 0.7618055555555531 | 0 |
| 0.7624999999999975 | 0 |
| 0.763194444444442 | 0 |
| 0.7638888888888864 | 0 |
| 0.7645833333333308 | 0 |
| 0.7652777777777753 | 0 |
| 0.7659722222222197 | 0 |
| 0.7666666666666642 | 0 |
| 0.7673611111111086 | 0 |
| 0.768055555555553 | 0 |
| 0.7687499999999975 | 0 |
| 0.7694444444444419 | 0 |
| 0.7701388888888864 | 0 |
| 0.7708333333333308 | 0 |
| 0.7715277777777753 | 0 |
| 0.7722222222222197 | 0 |
| 0.7729166666666641 | 0 |
| 0.7736111111111086 | 0 |
| 0.774305555555553 | 0 |
| 0.7749999999999975 | 0 |
| 0.7756944444444419 | 0 |
| 0.7763888888888864 | 0 |
| 0.7770833333333308 | 0 |
| 0.7777777777777752 | 0 |
| 0.7784722222222197 | 0 |
| 0.7791666666666641 | 0 |
| 0.7798611111111086 | 0 |
| 0.780555555555553 | 0 |
| 0.7812499999999974 | 0 |
| 0.7819444444444419 | 0 |
| 0.7826388888888863 | 0 |
| 0.7833333333333308 | 0 |
| 0.7840277777777752 | 0 |
| 0.7847222222222197 | 0 |
| 0.7854166666666641 | 0 |
| 0.7861111111111085 | 0 |
| 0.786805555555553 | 0 |
| 0.7874999999999974 | 0 |
| 0.7881944444444419 | 0 |
| 0.7888888888888863 | 0 |
| 0.7895833333333308 | 0 |
| 0.7902777777777752 | 0 |
| 0.7909722222222196 | 0 |
| 0.7916666666666641 | 0 |
| 0.7923611111111085 | 0 |
| 0.793055555555553 | 0 |
| 0.7937499999999974 | 0 |
| 0.7944444444444418 | 0 |
| 0.7951388888888863 | 0 |
| 0.7958333333333307 | 0 |
| 0.7965277777777752 | 0 |
| 0.7972222222222196 | 0 |
| 0.797916666666664 | 0 |
| 0.7986111111111085 | 0 |
| 0.7993055555555529 | 0 |
| 0.7999999999999974 | 0 |
| 0.8006944444444418 | 0 |
| 0.8013888888888863 | 0 |
| 0.8020833333333307 | 0 |
| 0.8027777777777751 | 0 |
| 0.8034722222222196 | 0 |
| 0.804166666666664 | 0 |
| 0.8048611111111085 | 0 |
| 0.8055555555555529 | 0 |
| 0.8062499999999974 | 0 |
| 0.8069444444444418 | 0 |
| 0.8076388888888862 | 0 |
| 0.8083333333333307 | 0 |
| 0.8090277777777751 | 0 |
| 0.8097222222222196 | 0 |
| 0.810416666666664 | 0 |
| 0.8111111111111085 | 0 |
| 0.8118055555555529 | 0 |
| 0.8124999999999973 | 0 |
| 0.8131944444444418 | 0 |
| 0.8138888888888862 | 0 |
| 0.8145833333333307 | 0 |
| 0.8152777777777751 | 0 |
| 0.8159722222222195 | 0 |
| 0.816666666666664 | 0 |
| 0.8173611111111084 | 0 |
| 0.8180555555555529 | 0 |
| 0.8187499999999973 | 0 |
| 0.8194444444444418 | 0 |
| 0.8201388888888862 | 0 |
| 0.8208333333333306 | 0 |
| 0.8215277777777751 | 0 |
| 0.8222222222222195 | 0 |
| 0.822916666666664 | 0 |
| 0.8236111111111084 | 0 |
| 0.8243055555555528 | 0 |
| 0.8249999999999973 | 0 |
| 0.8256944444444417 | 0 |
| 0.8263888888888862 | 0 |
| 0.8270833333333306 | 0 |
| 0.8277777777777751 | 0 |
| 0.8284722222222195 | 0 |
| 0.8291666666666639 | 0 |
| 0.8298611111111084 | 0 |
| 0.8305555555555528 | 0 |
| 0.8312499999999973 | 0 |
| 0.8319444444444417 | 0 |
| 0.8326388888888862 | 0 |
| 0.8333333333333306 | 0 |
| 0.834027777777775 | 0 |
| 0.8347222222222195 | 0 |
| 0.8354166666666639 | 0 |
| 0.8361111111111084 | 0 |
| 0.8368055555555528 | 0 |
| 0.8374999999999972 | 0 |
| 0.8381944444444417 | 0 |
| 0.8388888888888861 | 0 |
| 0.8395833333333306 | 0 |
| 0.840277777777775 | 0 |
| 0.8409722222222195 | 0 |
| 0.8416666666666639 | 0 |
| 0.8423611111111083 | 0 |
| 0.8430555555555528 | 0 |
| 0.8437499999999972 | 0 |
| 0.8444444444444417 | 0 |
| 0.8451388888888861 | 0 |
| 0.8458333333333306 | 0 |
| 0.846527777777775 | 0 |
| 0.8472222222222194 | 0 |
| 0.8479166666666639 | 0 |
| 0.8486111111111083 | 0 |
| 0.8493055555555528 | 0 |
| 0.8499999999999972 | 0 |
| 0.8506944444444416 | 0 |
| 0.8513888888888861 | 0 |
| 0.8520833333333305 | 0 |
| 0.852777777777775 | 0 |
| 0.8534722222222194 | 0 |
| 0.8541666666666639 | 0 |
| 0.8548611111111083 | 0 |
| 0.8555555555555527 | 0 |
| 0.8562499999999972 | 0 |
| 0.8569444444444416 | 0 |
| 0.8576388888888861 | 0 |
| 0.8583333333333305 | 0 |
| 0.859027777777775 | 0 |
| 0.8597222222222194 | 0 |
| 0.8604166666666638 | 0 |
| 0.8611111111111083 | 0 |
| 0.8618055555555527 | 0 |
| 0.8624999999999972 | 0 |
| 0.8631944444444416 | 0 |
| 0.863888888888886 | 0 |
| 0.8645833333333305 | 0 |
| 0.8652777777777749 | 0 |
| 0.8659722222222194 | 0 |
| 0.8666666666666638 | 0 |
| 0.8673611111111083 | 0 |
| 0.8680555555555527 | 0 |
| 0.8687499999999971 | 0 |
| 0.8694444444444416 | 0 |
| 0.870138888888886 | 0 |
| 0.8708333333333305 | 0 |
| 0.8715277777777749 | 0 |
| 0.8722222222222193 | 0 |
| 0.8729166666666638 | 0 |
| 0.8736111111111082 | 0 |
| 0.8743055555555527 | 0 |
| 0.8749999999999971 | 0 |
| 0.8756944444444416 | 0 |
| 0.876388888888886 | 0 |
| 0.8770833333333304 | 0 |
| 0.8777777777777749 | 0 |
| 0.8784722222222193 | 0 |
| 0.8791666666666638 | 0 |
| 0.8798611111111082 | 0 |
| 0.8805555555555526 | 0 |
| 0.8812499999999971 | 0 |
| 0.8819444444444415 | 0 |
| 0.882638888888886 | 0 |
| 0.8833333333333304 | 0 |
| 0.8840277777777749 | 0 |
| 0.8847222222222193 | 0 |
| 0.8854166666666637 | 0 |
| 0.8861111111111082 | 0 |
| 0.8868055555555526 | 0 |
| 0.8874999999999971 | 0 |
| 0.8881944444444415 | 0 |
| 0.888888888888886 | 0 |
| 0.8895833333333304 | 0 |
| 0.8902777777777748 | 0 |
| 0.8909722222222193 | 0 |
| 0.8916666666666637 | 0 |
| 0.8923611111111082 | 0 |
| 0.8930555555555526 | 0 |
| 0.893749999999997 | 0 |
| 0.8944444444444415 | 0 |
| 0.8951388888888859 | 0 |
| 0.8958333333333304 | 0 |
| 0.8965277777777748 | 0 |
| 0.8972222222222193 | 0 |
| 0.8979166666666637 | 0 |
| 0.8986111111111081 | 0 |
| 0.8993055555555526 | 0 |
| 0.899999999999997 | 0 |
| 0.9006944444444415 | 0 |
| 0.9013888888888859 | 0 |
| 0.9020833333333304 | 0 |
| 0.9027777777777748 | 0 |
| 0.9034722222222192 | 0 |
| 0.9041666666666637 | 0 |
| 0.9048611111111081 | 0 |
| 0.9055555555555526 | 0 |
| 0.906249999999997 | 0 |
| 0.9069444444444414 | 0 |
| 0.9076388888888859 | 0 |
| 0.9083333333333303 | 0 |
| 0.9090277777777748 | 0 |
| 0.9097222222222192 | 0 |
| 0.9104166666666637 | 0 |
| 0.9111111111111081 | 0 |
| 0.9118055555555525 | 0 |
| 0.912499999999997 | 0 |
| 0.9131944444444414 | 0 |
| 0.9138888888888859 | 0 |
| 0.9145833333333303 | 0 |
| 0.9152777777777747 | 0 |
| 0.9159722222222192 | 0 |
| 0.9166666666666636 | 0 |
| 0.9173611111111081 | 0 |
| 0.9180555555555525 | 0 |
| 0.918749999999997 | 0 |
| 0.9194444444444414 | 0 |
| 0.9201388888888858 | 0 |
| 0.9208333333333303 | 0 |
| 0.9215277777777747 | 0 |
| 0.9222222222222192 | 0 |
| 0.9229166666666636 | 0 |
| 0.923611111111108 | 0 |
| 0.9243055555555525 | 0 |
| 0.9249999999999969 | 0 |
| 0.9256944444444414 | 0 |
| 0.9263888888888858 | 0 |
| 0.9270833333333303 | 0 |
| 0.9277777777777747 | 0 |
| 0.9284722222222191 | 0 |
| 0.9291666666666636 | 0 |
| 0.929861111111108 | 0 |
| 0.9305555555555525 | 0 |
| 0.9312499999999969 | 0 |
| 0.9319444444444414 | 0 |
| 0.9326388888888858 | 0 |
| 0.9333333333333302 | 0 |
| 0.9340277777777747 | 0 |
| 0.9347222222222191 | 0 |
| 0.9354166666666636 | 0 |
| 0.936111111111108 | 0 |
| 0.9368055555555524 | 0 |
| 0.9374999999999969 | 0 |
| 0.9381944444444413 | 0 |
| 0.9388888888888858 | 0 |
| 0.9395833333333302 | 0 |
| 0.9402777777777747 | 0 |
| 0.9409722222222191 | 0 |
| 0.9416666666666635 | 0 |
| 0.942361111111108 | 0 |
| 0.9430555555555524 | 0 |
| 0.9437499999999969 | 0 |
| 0.9444444444444413 | 0 |
| 0.9451388888888858 | 0 |
| 0.9458333333333302 | 0 |
| 0.9465277777777746 | 0 |
| 0.9472222222222191 | 0 |
| 0.9479166666666635 | 0 |
| 0.948611111111108 | 0 |
| 0.9493055555555524 | 0 |
| 0.9499999999999968 | 0 |
| 0.9506944444444413 | 0 |
| 0.9513888888888857 | 0 |
| 0.9520833333333302 | 0 |
| 0.9527777777777746 | 0 |
| 0.9534722222222191 | 0 |
| 0.9541666666666635 | 0 |
| 0.9548611111111079 | 0 |
| 0.9555555555555524 | 0 |
| 0.9562499999999968 | 0 |
| 0.9569444444444413 | 0 |
| 0.9576388888888857 | 0 |
| 0.9583333333333302 | 0 |
| 0.9590277777777746 | 0 |
| 0.959722222222219 | 0 |
| 0.9604166666666635 | 0 |
| 0.9611111111111079 | 0 |
| 0.9618055555555524 | 0 |
| 0.9624999999999968 | 0 |
| 0.9631944444444412 | 0 |
| 0.9638888888888857 | 0 |
| 0.9645833333333301 | 0 |
| 0.9652777777777746 | 0 |
| 0.965972222222219 | 0 |
| 0.9666666666666635 | 0 |
| 0.9673611111111079 | 0 |
| 0.9680555555555523 | 0 |
| 0.9687499999999968 | 0 |
| 0.9694444444444412 | 0 |
| 0.9701388888888857 | 0 |
| 0.9708333333333301 | 0 |
| 0.9715277777777745 | 0 |
| 0.972222222222219 | 0 |
| 0.9729166666666634 | 0 |
| 0.9736111111111079 | 0 |
| 0.9743055555555523 | 0 |
| 0.9749999999999968 | 0 |
| 0.9756944444444412 | 0 |
| 0.9763888888888856 | 0 |
| 0.9770833333333301 | 0 |
| 0.9777777777777745 | 0 |
| 0.978472222222219 | 0 |
| 0.9791666666666634 | 0 |
| 0.9798611111111079 | 0 |
| 0.9805555555555523 | 0 |
| 0.9812499999999967 | 0 |
| 0.9819444444444412 | 0 |
| 0.9826388888888856 | 0 |
| 0.9833333333333301 | 0 |
| 0.9840277777777745 | 0 |
| 0.984722222222219 | 0 |
| 0.9854166666666634 | 0 |
| 0.9861111111111078 | 0 |
| 0.9868055555555523 | 0 |
| 0.9874999999999967 | 0 |
| 0.9881944444444412 | 0 |
| 0.9888888888888856 | 0 |
| 0.98958333333333 | 0 |
| 0.9902777777777745 | 0 |
| 0.9909722222222189 | 0 |
| 0.9916666666666634 | 0 |
| 0.9923611111111078 | 0 |
| 0.9930555555555522 | 0 |
| 0.9937499999999967 | 0 |
| 0.9944444444444411 | 0 |
| 0.9951388888888856 | 0 |
| 0.99583333333333 | 0 |
| 0.9965277777777745 | 0 |
| 0.9972222222222189 | 0 |
| 0.9979166666666633 | 0 |
| 0.9986111111111078 | 0 |
| 0.9993055555555522 | 0 |